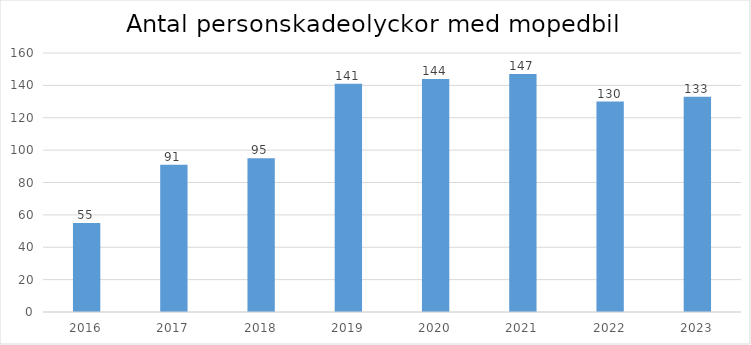
| Category | Total |
|---|---|
| 2016.0 | 55 |
| 2017.0 | 91 |
| 2018.0 | 95 |
| 2019.0 | 141 |
| 2020.0 | 144 |
| 2021.0 | 147 |
| 2022.0 | 130 |
| 2023.0 | 133 |